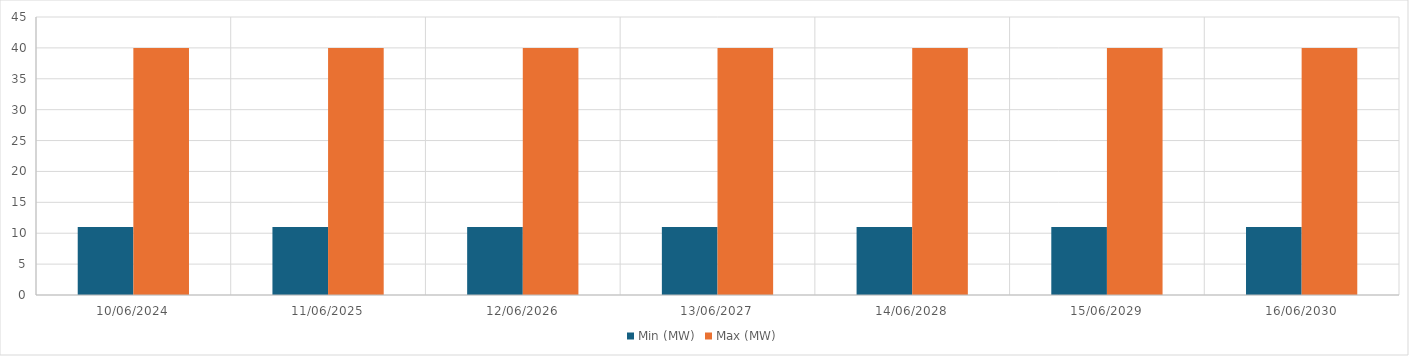
| Category | Min (MW) | Max (MW) |
|---|---|---|
| 10/06/2024 | 11 | 40 |
| 11/06/2025 | 11 | 40 |
| 12/06/2026 | 11 | 40 |
| 13/06/2027 | 11 | 40 |
| 14/06/2028 | 11 | 40 |
| 15/06/2029 | 11 | 40 |
| 16/06/2030 | 11 | 40 |